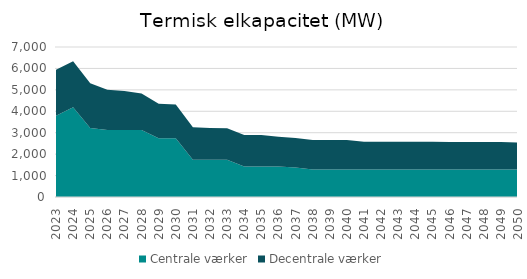
| Category | Centrale værker | Decentrale værker |
|---|---|---|
| 2023.0 | 3789.3 | 2147.08 |
| 2024.0 | 4186.3 | 2147.08 |
| 2025.0 | 3218 | 2084.68 |
| 2026.0 | 3127 | 1880.65 |
| 2027.0 | 3127 | 1817.78 |
| 2028.0 | 3127 | 1707.15 |
| 2029.0 | 2742 | 1615.1 |
| 2030.0 | 2742 | 1569.77 |
| 2031.0 | 1737.3 | 1516.8 |
| 2032.0 | 1737.3 | 1487.67 |
| 2033.0 | 1737.3 | 1470.74 |
| 2034.0 | 1423.3 | 1470.74 |
| 2035.0 | 1423.3 | 1470.74 |
| 2036.0 | 1423.3 | 1386.5 |
| 2037.0 | 1371.3 | 1386.5 |
| 2038.0 | 1278 | 1386.5 |
| 2039.0 | 1278 | 1386.5 |
| 2040.0 | 1278 | 1386.5 |
| 2041.0 | 1278 | 1298.09 |
| 2042.0 | 1278 | 1298.09 |
| 2043.0 | 1278 | 1298.09 |
| 2044.0 | 1278 | 1297.75 |
| 2045.0 | 1278 | 1297.76 |
| 2046.0 | 1278 | 1289.31 |
| 2047.0 | 1278 | 1289.3 |
| 2048.0 | 1278 | 1289.3 |
| 2049.0 | 1278 | 1289.3 |
| 2050.0 | 1278 | 1266.63 |